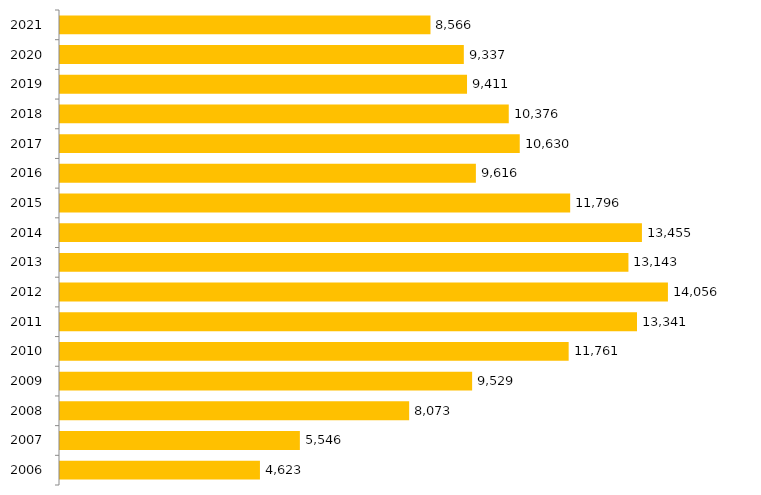
| Category | Inscritos |
|---|---|
| 2006.0 | 4623 |
| 2007.0 | 5546 |
| 2008.0 | 8073 |
| 2009.0 | 9529 |
| 2010.0 | 11761 |
| 2011.0 | 13341 |
| 2012.0 | 14056 |
| 2013.0 | 13143 |
| 2014.0 | 13455 |
| 2015.0 | 11796 |
| 2016.0 | 9616 |
| 2017.0 | 10630 |
| 2018.0 | 10376 |
| 2019.0 | 9411 |
| 2020.0 | 9337 |
| 2021.0 | 8566 |